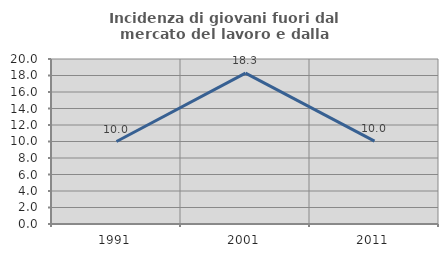
| Category | Incidenza di giovani fuori dal mercato del lavoro e dalla formazione  |
|---|---|
| 1991.0 | 10 |
| 2001.0 | 18.297 |
| 2011.0 | 10.044 |